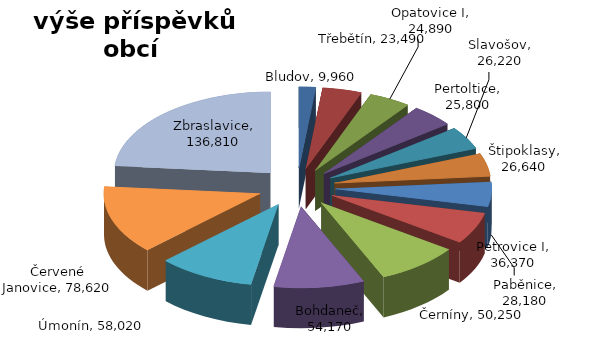
| Category | Series 1 | Series 0 |
|---|---|---|
| Bludov | 9960 | 9960 |
| Třebětín | 23490 | 23490 |
| Opatovice I | 24890 | 24890 |
| Pertoltice | 25800 | 25800 |
| Slavošov | 26220 | 26220 |
| Štipoklasy | 26640 | 26640 |
| Paběnice | 28180 | 28180 |
| Petrovice I | 36370 | 36370 |
| Černíny | 50250 | 50250 |
| Bohdaneč | 54170 | 54170 |
| Úmonín | 58020 | 58020 |
| Červené Janovice | 78620 | 78620 |
| Zbraslavice | 136810 | 136810 |